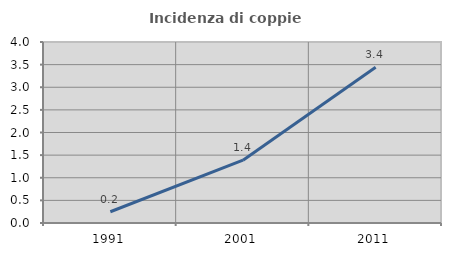
| Category | Incidenza di coppie miste |
|---|---|
| 1991.0 | 0.248 |
| 2001.0 | 1.389 |
| 2011.0 | 3.441 |